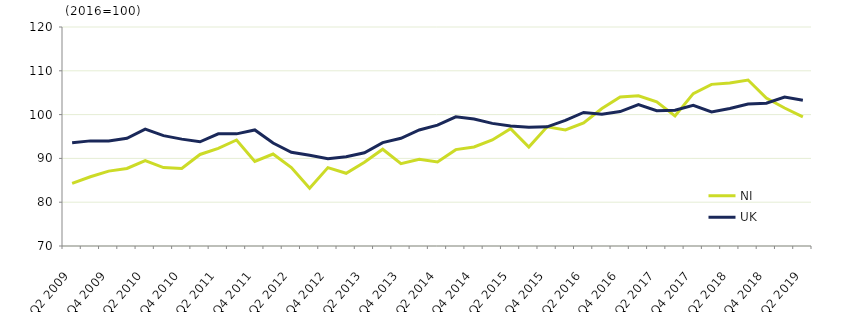
| Category | NI | UK  |
|---|---|---|
| Q2 2009 | 84.3 | 93.6 |
|  | 85.8 | 94 |
| Q4 2009 | 87.1 | 94 |
|  | 87.7 | 94.6 |
| Q2 2010 | 89.5 | 96.7 |
|  | 87.9 | 95.2 |
| Q4 2010 | 87.7 | 94.4 |
|  | 90.9 | 93.8 |
| Q2 2011 | 92.3 | 95.6 |
|  | 94.2 | 95.6 |
| Q4 2011 | 89.3 | 96.5 |
|  | 91 | 93.5 |
| Q2 2012 | 87.9 | 91.4 |
|  | 83.2 | 90.7 |
| Q4 2012 | 87.9 | 89.9 |
|  | 86.6 | 90.4 |
| Q2 2013 | 89.1 | 91.3 |
|  | 92.1 | 93.6 |
| Q4 2013 | 88.8 | 94.6 |
|  | 89.8 | 96.5 |
| Q2 2014 | 89.2 | 97.6 |
|  | 92 | 99.5 |
| Q4 2014 | 92.6 | 99 |
|  | 94.2 | 98 |
| Q2 2015 | 96.8 | 97.4 |
|  | 92.6 | 97.1 |
| Q4 2015 | 97.2 | 97.2 |
|  | 96.5 | 98.7 |
| Q2 2016 | 98.1 | 100.5 |
|  | 101.4 | 100.1 |
| Q4 2016 | 104 | 100.7 |
|  | 104.3 | 102.3 |
| Q2 2017 | 102.9 | 100.9 |
|  | 99.7 | 101 |
| Q4 2017 | 104.8 | 102.1 |
|  | 106.9 | 100.6 |
| Q2 2018 | 107.2 | 101.4 |
|  | 107.9 | 102.4 |
| Q4 2018 | 103.8 | 102.6 |
|  | 101.5 | 104 |
| Q2 2019 | 99.5 | 103.3 |